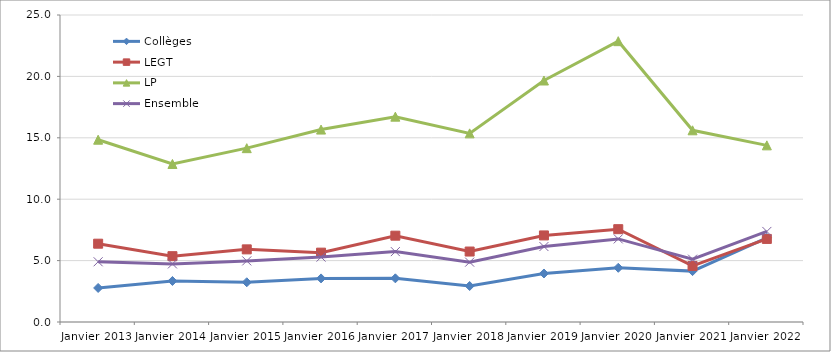
| Category | Collèges | LEGT | LP | Ensemble |
|---|---|---|---|---|
| Janvier 2013 | 2.772 | 6.376 | 14.844 | 4.904 |
| Janvier 2014 | 3.341 | 5.36 | 12.869 | 4.73 |
| Janvier 2015 | 3.237 | 5.915 | 14.156 | 4.976 |
| Janvier 2016 | 3.55 | 5.648 | 15.671 | 5.285 |
| Janvier 2017 | 3.556 | 7.029 | 16.721 | 5.731 |
| Janvier 2018 | 2.931 | 5.737 | 15.362 | 4.873 |
| Janvier 2019 | 3.95 | 7.05 | 19.665 | 6.145 |
| Janvier 2020 | 4.414 | 7.559 | 22.869 | 6.766 |
| Janvier 2021 | 4.144 | 4.563 | 15.611 | 5.115 |
| Janvier 2022 | 6.852 | 6.764 | 14.385 | 7.374 |